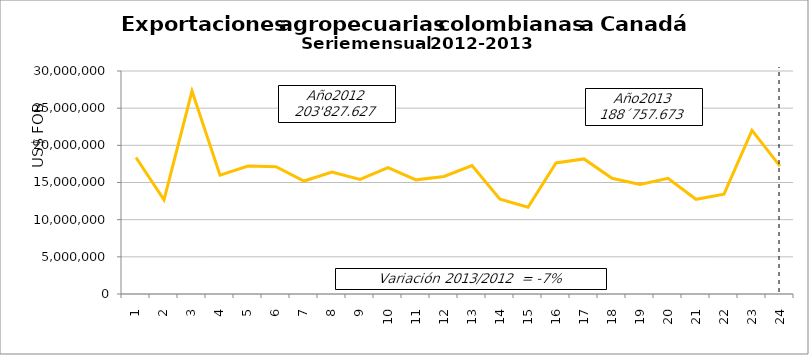
| Category | Series 0 |
|---|---|
| 0 | 18360378.61 |
| 1 | 12657701.71 |
| 2 | 27290393.25 |
| 3 | 15994647.42 |
| 4 | 17214840.67 |
| 5 | 17116241.81 |
| 6 | 15199854.45 |
| 7 | 16390438.94 |
| 8 | 15416889.01 |
| 9 | 17014286.49 |
| 10 | 15355829.1 |
| 11 | 15816125.37 |
| 12 | 17268208.64 |
| 13 | 12752692.04 |
| 14 | 11677338.84 |
| 15 | 17624038.37 |
| 16 | 18173887.5 |
| 17 | 15570597.35 |
| 18 | 14728209.81 |
| 19 | 15569046 |
| 20 | 12738864 |
| 21 | 13436036.06 |
| 22 | 22012644 |
| 23 | 17206110.72 |